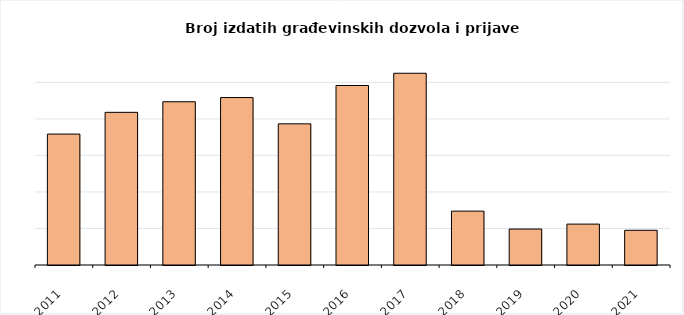
| Category | Broj izdatih građevinskih dozvola i prijava radova |
|---|---|
| 2011.0 | 717 |
| 2012.0 | 836 |
| 2013.0 | 894 |
| 2014.0 | 917 |
| 2015.0 | 773 |
| 2016.0 | 983 |
| 2017.0 | 1050 |
| 2018.0 | 295 |
| 2019.0 | 197 |
| 2020.0 | 224 |
| 2021.0 | 190 |